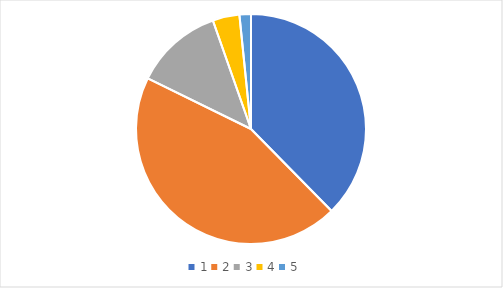
| Category | Series 0 |
|---|---|
| 0 | 70 |
| 1 | 83 |
| 2 | 23 |
| 3 | 7 |
| 4 | 3 |